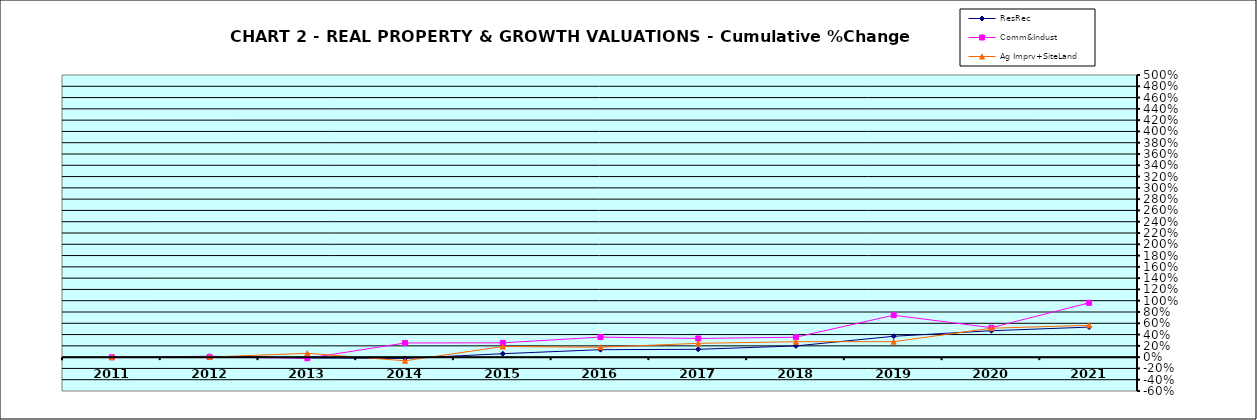
| Category | ResRec | Comm&Indust | Ag Imprv+SiteLand |
|---|---|---|---|
| 2011.0 | -0.003 | -0.003 | 0 |
| 2012.0 | 0.015 | 0.002 | 0.002 |
| 2013.0 | -0.015 | -0.02 | 0.068 |
| 2014.0 | -0.023 | 0.251 | -0.064 |
| 2015.0 | 0.061 | 0.253 | 0.188 |
| 2016.0 | 0.132 | 0.355 | 0.175 |
| 2017.0 | 0.139 | 0.331 | 0.245 |
| 2018.0 | 0.199 | 0.353 | 0.273 |
| 2019.0 | 0.37 | 0.743 | 0.274 |
| 2020.0 | 0.468 | 0.522 | 0.513 |
| 2021.0 | 0.532 | 0.963 | 0.564 |